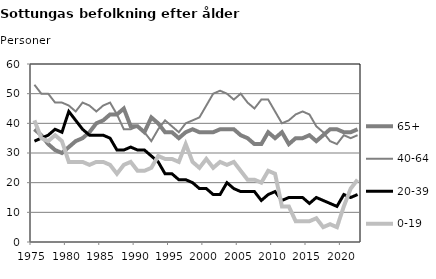
| Category | 65+ | 40-64 | 20-39 | 0-19 |
|---|---|---|---|---|
| 1975.0 | 38 | 53 | 34 | 41 |
| 1976.0 | 36 | 50 | 35 | 35 |
| 1977.0 | 33 | 50 | 36 | 34 |
| 1978.0 | 31 | 47 | 38 | 36 |
| 1979.0 | 30 | 47 | 37 | 34 |
| 1980.0 | 32 | 46 | 44 | 27 |
| 1981.0 | 34 | 44 | 41 | 27 |
| 1982.0 | 35 | 47 | 38 | 27 |
| 1983.0 | 37 | 46 | 36 | 26 |
| 1984.0 | 40 | 44 | 36 | 27 |
| 1985.0 | 41 | 46 | 36 | 27 |
| 1986.0 | 43 | 47 | 35 | 26 |
| 1987.0 | 43 | 43 | 31 | 23 |
| 1988.0 | 45 | 38 | 31 | 26 |
| 1989.0 | 39 | 38 | 32 | 27 |
| 1990.0 | 39 | 39 | 31 | 24 |
| 1991.0 | 37 | 37 | 31 | 24 |
| 1992.0 | 42 | 34 | 29 | 25 |
| 1993.0 | 40 | 38 | 27 | 29 |
| 1994.0 | 37 | 41 | 23 | 28 |
| 1995.0 | 37 | 39 | 23 | 28 |
| 1996.0 | 35 | 37 | 21 | 27 |
| 1997.0 | 37 | 40 | 21 | 33 |
| 1998.0 | 38 | 41 | 20 | 27 |
| 1999.0 | 37 | 42 | 18 | 25 |
| 2000.0 | 37 | 46 | 18 | 28 |
| 2001.0 | 37 | 50 | 16 | 25 |
| 2002.0 | 38 | 51 | 16 | 27 |
| 2003.0 | 38 | 50 | 20 | 26 |
| 2004.0 | 38 | 48 | 18 | 27 |
| 2005.0 | 36 | 50 | 17 | 24 |
| 2006.0 | 35 | 47 | 17 | 21 |
| 2007.0 | 33 | 45 | 17 | 21 |
| 2008.0 | 33 | 48 | 14 | 20 |
| 2009.0 | 37 | 48 | 16 | 24 |
| 2010.0 | 35 | 44 | 17 | 23 |
| 2011.0 | 37 | 40 | 14 | 12 |
| 2012.0 | 33 | 41 | 15 | 12 |
| 2013.0 | 35 | 43 | 15 | 7 |
| 2014.0 | 35 | 44 | 15 | 7 |
| 2015.0 | 36 | 43 | 13 | 7 |
| 2016.0 | 34 | 39 | 15 | 8 |
| 2017.0 | 36 | 37 | 14 | 5 |
| 2018.0 | 38 | 34 | 13 | 6 |
| 2019.0 | 38 | 33 | 12 | 5 |
| 2020.0 | 37 | 36 | 16 | 12 |
| 2021.0 | 37 | 35 | 15 | 18 |
| 2022.0 | 38 | 36 | 16 | 21 |